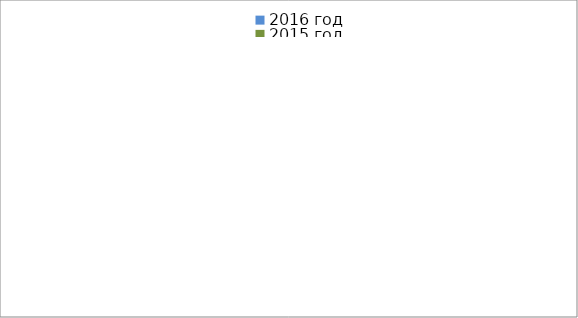
| Category | 2016 год | 2015 год |
|---|---|---|
|  - поджог | 19 | 6 |
|  - неосторожное обращение с огнём | 16 | 23 |
|  - НПТЭ электрооборудования | 2 | 5 |
|  - НПУ и Э печей | 20 | 21 |
|  - НПУ и Э транспортных средств | 9 | 29 |
|   -Шалость с огнем детей | 3 | 2 |
|  -НППБ при эксплуатации эл.приборов | 4 | 9 |
|  - курение | 3 | 9 |
| - прочие | 54 | 44 |
| - не установленные причины | 11 | 4 |